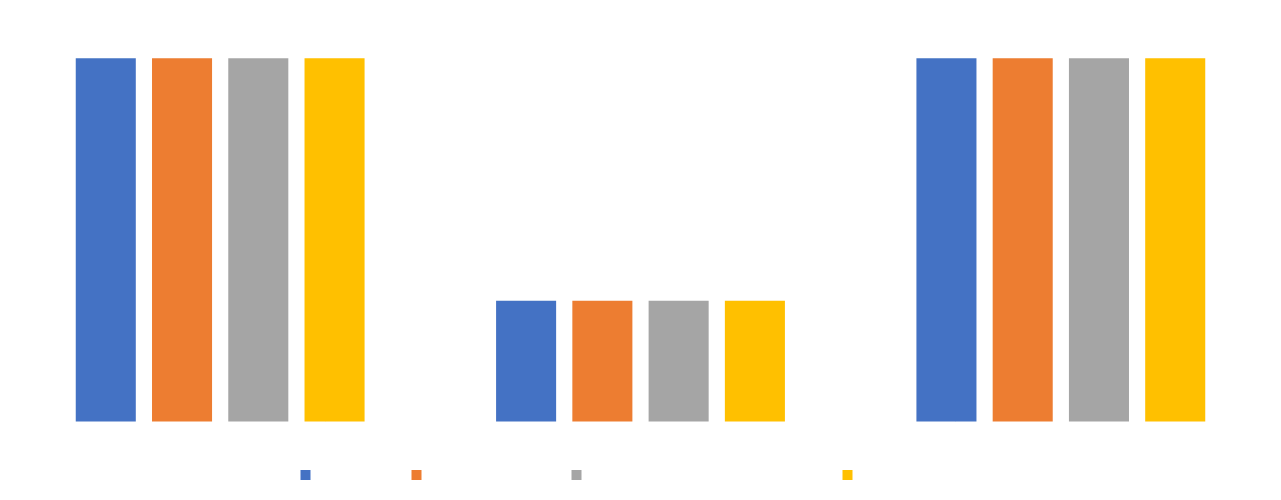
| Category | Students | Teaching staff | Professional services staff | Researchers |
|---|---|---|---|---|
| Good or above | 0.429 | 0.429 | 0.429 | 0.429 |
| Average | 0.143 | 0.143 | 0.143 | 0.143 |
| Poor or below | 0.429 | 0.429 | 0.429 | 0.429 |